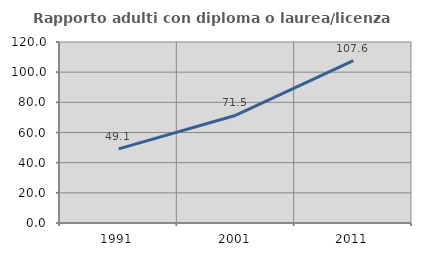
| Category | Rapporto adulti con diploma o laurea/licenza media  |
|---|---|
| 1991.0 | 49.142 |
| 2001.0 | 71.474 |
| 2011.0 | 107.621 |